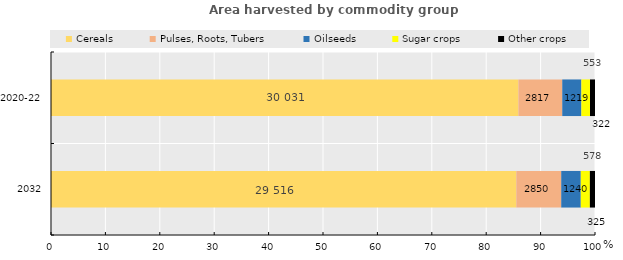
| Category | Cereals | Pulses, Roots, Tubers | Oilseeds | Sugar crops | Other crops |
|---|---|---|---|---|---|
| 2032 | 85.534 | 8.258 | 3.593 | 1.674 | 0.941 |
| 2020-22 | 85.922 | 8.059 | 3.517 | 1.582 | 0.921 |